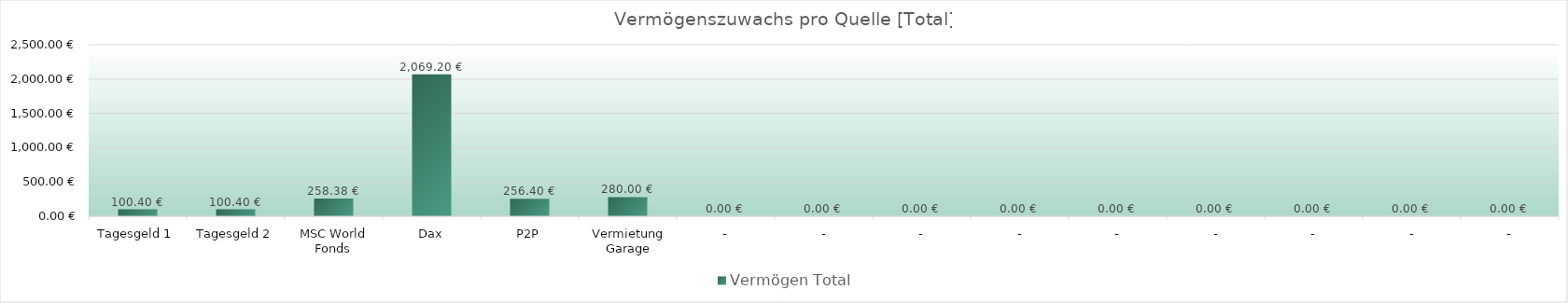
| Category | Vermögen Total |
|---|---|
| Tagesgeld 1 | 100.4 |
| Tagesgeld 2 | 100.4 |
| MSC World Fonds | 258.38 |
| Dax | 2069.2 |
| P2P | 256.4 |
| Vermietung Garage | 280 |
|  - | 0 |
|  - | 0 |
|  - | 0 |
|  - | 0 |
|  - | 0 |
|  - | 0 |
|  - | 0 |
|  - | 0 |
|  - | 0 |